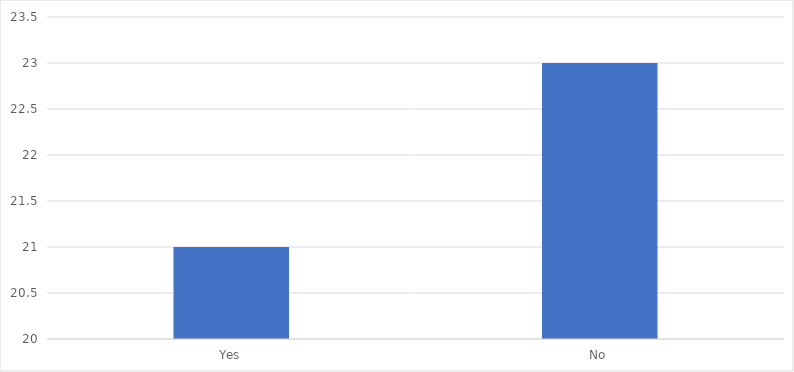
| Category | Number of Responses |
|---|---|
| Yes | 21 |
| No | 23 |